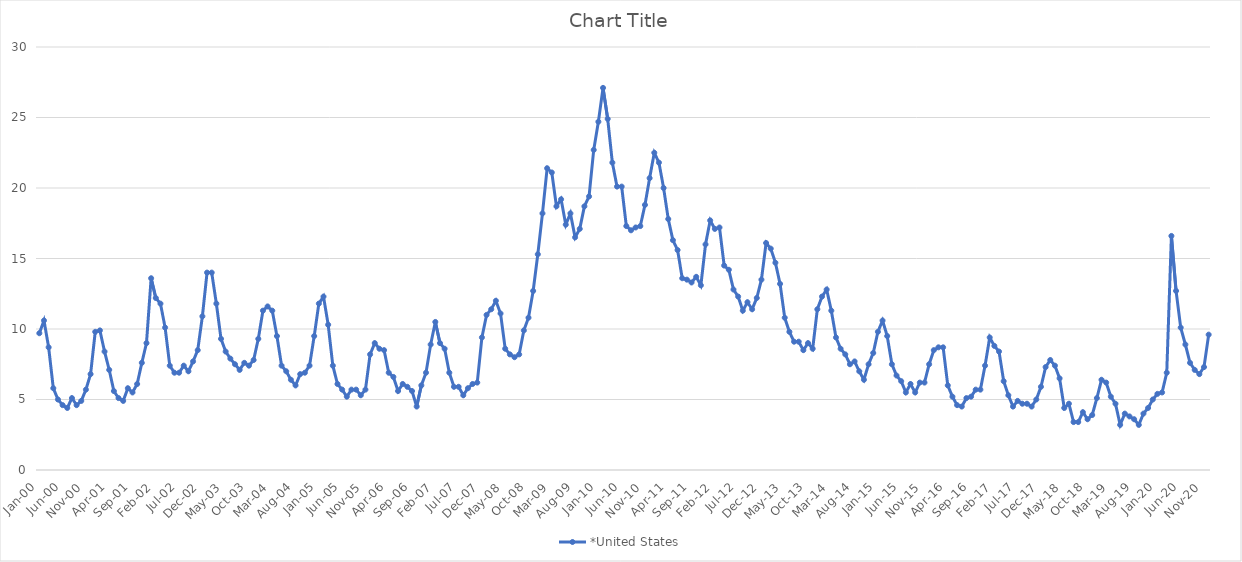
| Category | *United States | Alaska | Alabama | Arkansas | Arizona | California | Colorado | Connecticut | Delaware | Florida | Georgia | Hawaii | Iowa | Idaho | Illinois | Indiana | Kansas | Kentucky | Louisiana | Massachusetts | Maryland | Maine | Michigan | Minnesota | Missouri | Mississippi | Montana | North Carolina | North Dakota | Nebraska | New Hampshire | New Jersey | New Mexico | Nevada | New York | Ohio | Oklahoma | Oregon | Pennsylvania | Rhode Island | South Carolina | South Dakota | Tennessee | Texas | Utah | Virginia | Vermont | Washington | Wisconsin | West Virginia | Wyoming |
|---|---|---|---|---|---|---|---|---|---|---|---|---|---|---|---|---|---|---|---|---|---|---|---|---|---|---|---|---|---|---|---|---|---|---|---|---|---|---|---|---|---|---|---|---|---|---|---|---|---|---|---|
| Jan-00 | 9.7 |  |  |  |  |  |  |  |  |  |  |  |  |  |  |  |  |  |  |  |  |  |  |  |  |  |  |  |  |  |  |  |  |  |  |  |  |  |  |  |  |  |  |  |  |  |  |  |  |  |  |
| Feb-00 | 10.6 |  |  |  |  |  |  |  |  |  |  |  |  |  |  |  |  |  |  |  |  |  |  |  |  |  |  |  |  |  |  |  |  |  |  |  |  |  |  |  |  |  |  |  |  |  |  |  |  |  |  |
| Mar-00 | 8.7 |  |  |  |  |  |  |  |  |  |  |  |  |  |  |  |  |  |  |  |  |  |  |  |  |  |  |  |  |  |  |  |  |  |  |  |  |  |  |  |  |  |  |  |  |  |  |  |  |  |  |
| Apr-00 | 5.8 |  |  |  |  |  |  |  |  |  |  |  |  |  |  |  |  |  |  |  |  |  |  |  |  |  |  |  |  |  |  |  |  |  |  |  |  |  |  |  |  |  |  |  |  |  |  |  |  |  |  |
| May-00 | 5 |  |  |  |  |  |  |  |  |  |  |  |  |  |  |  |  |  |  |  |  |  |  |  |  |  |  |  |  |  |  |  |  |  |  |  |  |  |  |  |  |  |  |  |  |  |  |  |  |  |  |
| Jun-00 | 4.6 |  |  |  |  |  |  |  |  |  |  |  |  |  |  |  |  |  |  |  |  |  |  |  |  |  |  |  |  |  |  |  |  |  |  |  |  |  |  |  |  |  |  |  |  |  |  |  |  |  |  |
| Jul-00 | 4.4 |  |  |  |  |  |  |  |  |  |  |  |  |  |  |  |  |  |  |  |  |  |  |  |  |  |  |  |  |  |  |  |  |  |  |  |  |  |  |  |  |  |  |  |  |  |  |  |  |  |  |
| Aug-00 | 5.1 |  |  |  |  |  |  |  |  |  |  |  |  |  |  |  |  |  |  |  |  |  |  |  |  |  |  |  |  |  |  |  |  |  |  |  |  |  |  |  |  |  |  |  |  |  |  |  |  |  |  |
| Sep-00 | 4.6 |  |  |  |  |  |  |  |  |  |  |  |  |  |  |  |  |  |  |  |  |  |  |  |  |  |  |  |  |  |  |  |  |  |  |  |  |  |  |  |  |  |  |  |  |  |  |  |  |  |  |
| Oct-00 | 4.9 |  |  |  |  |  |  |  |  |  |  |  |  |  |  |  |  |  |  |  |  |  |  |  |  |  |  |  |  |  |  |  |  |  |  |  |  |  |  |  |  |  |  |  |  |  |  |  |  |  |  |
| Nov-00 | 5.7 |  |  |  |  |  |  |  |  |  |  |  |  |  |  |  |  |  |  |  |  |  |  |  |  |  |  |  |  |  |  |  |  |  |  |  |  |  |  |  |  |  |  |  |  |  |  |  |  |  |  |
| Dec-00 | 6.8 |  |  |  |  |  |  |  |  |  |  |  |  |  |  |  |  |  |  |  |  |  |  |  |  |  |  |  |  |  |  |  |  |  |  |  |  |  |  |  |  |  |  |  |  |  |  |  |  |  |  |
| Jan-01 | 9.8 |  |  |  |  |  |  |  |  |  |  |  |  |  |  |  |  |  |  |  |  |  |  |  |  |  |  |  |  |  |  |  |  |  |  |  |  |  |  |  |  |  |  |  |  |  |  |  |  |  |  |
| Feb-01 | 9.9 |  |  |  |  |  |  |  |  |  |  |  |  |  |  |  |  |  |  |  |  |  |  |  |  |  |  |  |  |  |  |  |  |  |  |  |  |  |  |  |  |  |  |  |  |  |  |  |  |  |  |
| Mar-01 | 8.4 |  |  |  |  |  |  |  |  |  |  |  |  |  |  |  |  |  |  |  |  |  |  |  |  |  |  |  |  |  |  |  |  |  |  |  |  |  |  |  |  |  |  |  |  |  |  |  |  |  |  |
| Apr-01 | 7.1 |  |  |  |  |  |  |  |  |  |  |  |  |  |  |  |  |  |  |  |  |  |  |  |  |  |  |  |  |  |  |  |  |  |  |  |  |  |  |  |  |  |  |  |  |  |  |  |  |  |  |
| May-01 | 5.6 |  |  |  |  |  |  |  |  |  |  |  |  |  |  |  |  |  |  |  |  |  |  |  |  |  |  |  |  |  |  |  |  |  |  |  |  |  |  |  |  |  |  |  |  |  |  |  |  |  |  |
| Jun-01 | 5.1 |  |  |  |  |  |  |  |  |  |  |  |  |  |  |  |  |  |  |  |  |  |  |  |  |  |  |  |  |  |  |  |  |  |  |  |  |  |  |  |  |  |  |  |  |  |  |  |  |  |  |
| Jul-01 | 4.9 |  |  |  |  |  |  |  |  |  |  |  |  |  |  |  |  |  |  |  |  |  |  |  |  |  |  |  |  |  |  |  |  |  |  |  |  |  |  |  |  |  |  |  |  |  |  |  |  |  |  |
| Aug-01 | 5.8 |  |  |  |  |  |  |  |  |  |  |  |  |  |  |  |  |  |  |  |  |  |  |  |  |  |  |  |  |  |  |  |  |  |  |  |  |  |  |  |  |  |  |  |  |  |  |  |  |  |  |
| Sep-01 | 5.5 |  |  |  |  |  |  |  |  |  |  |  |  |  |  |  |  |  |  |  |  |  |  |  |  |  |  |  |  |  |  |  |  |  |  |  |  |  |  |  |  |  |  |  |  |  |  |  |  |  |  |
| Oct-01 | 6.1 |  |  |  |  |  |  |  |  |  |  |  |  |  |  |  |  |  |  |  |  |  |  |  |  |  |  |  |  |  |  |  |  |  |  |  |  |  |  |  |  |  |  |  |  |  |  |  |  |  |  |
| Nov-01 | 7.6 |  |  |  |  |  |  |  |  |  |  |  |  |  |  |  |  |  |  |  |  |  |  |  |  |  |  |  |  |  |  |  |  |  |  |  |  |  |  |  |  |  |  |  |  |  |  |  |  |  |  |
| Dec-01 | 9 |  |  |  |  |  |  |  |  |  |  |  |  |  |  |  |  |  |  |  |  |  |  |  |  |  |  |  |  |  |  |  |  |  |  |  |  |  |  |  |  |  |  |  |  |  |  |  |  |  |  |
| Jan-02 | 13.6 |  |  |  |  |  |  |  |  |  |  |  |  |  |  |  |  |  |  |  |  |  |  |  |  |  |  |  |  |  |  |  |  |  |  |  |  |  |  |  |  |  |  |  |  |  |  |  |  |  |  |
| Feb-02 | 12.2 |  |  |  |  |  |  |  |  |  |  |  |  |  |  |  |  |  |  |  |  |  |  |  |  |  |  |  |  |  |  |  |  |  |  |  |  |  |  |  |  |  |  |  |  |  |  |  |  |  |  |
| Mar-02 | 11.8 |  |  |  |  |  |  |  |  |  |  |  |  |  |  |  |  |  |  |  |  |  |  |  |  |  |  |  |  |  |  |  |  |  |  |  |  |  |  |  |  |  |  |  |  |  |  |  |  |  |  |
| Apr-02 | 10.1 |  |  |  |  |  |  |  |  |  |  |  |  |  |  |  |  |  |  |  |  |  |  |  |  |  |  |  |  |  |  |  |  |  |  |  |  |  |  |  |  |  |  |  |  |  |  |  |  |  |  |
| May-02 | 7.4 |  |  |  |  |  |  |  |  |  |  |  |  |  |  |  |  |  |  |  |  |  |  |  |  |  |  |  |  |  |  |  |  |  |  |  |  |  |  |  |  |  |  |  |  |  |  |  |  |  |  |
| Jun-02 | 6.9 |  |  |  |  |  |  |  |  |  |  |  |  |  |  |  |  |  |  |  |  |  |  |  |  |  |  |  |  |  |  |  |  |  |  |  |  |  |  |  |  |  |  |  |  |  |  |  |  |  |  |
| Jul-02 | 6.9 |  |  |  |  |  |  |  |  |  |  |  |  |  |  |  |  |  |  |  |  |  |  |  |  |  |  |  |  |  |  |  |  |  |  |  |  |  |  |  |  |  |  |  |  |  |  |  |  |  |  |
| Aug-02 | 7.4 |  |  |  |  |  |  |  |  |  |  |  |  |  |  |  |  |  |  |  |  |  |  |  |  |  |  |  |  |  |  |  |  |  |  |  |  |  |  |  |  |  |  |  |  |  |  |  |  |  |  |
| Sep-02 | 7 |  |  |  |  |  |  |  |  |  |  |  |  |  |  |  |  |  |  |  |  |  |  |  |  |  |  |  |  |  |  |  |  |  |  |  |  |  |  |  |  |  |  |  |  |  |  |  |  |  |  |
| Oct-02 | 7.7 |  |  |  |  |  |  |  |  |  |  |  |  |  |  |  |  |  |  |  |  |  |  |  |  |  |  |  |  |  |  |  |  |  |  |  |  |  |  |  |  |  |  |  |  |  |  |  |  |  |  |
| Nov-02 | 8.5 |  |  |  |  |  |  |  |  |  |  |  |  |  |  |  |  |  |  |  |  |  |  |  |  |  |  |  |  |  |  |  |  |  |  |  |  |  |  |  |  |  |  |  |  |  |  |  |  |  |  |
| Dec-02 | 10.9 |  |  |  |  |  |  |  |  |  |  |  |  |  |  |  |  |  |  |  |  |  |  |  |  |  |  |  |  |  |  |  |  |  |  |  |  |  |  |  |  |  |  |  |  |  |  |  |  |  |  |
| Jan-03 | 14 |  |  |  |  |  |  |  |  |  |  |  |  |  |  |  |  |  |  |  |  |  |  |  |  |  |  |  |  |  |  |  |  |  |  |  |  |  |  |  |  |  |  |  |  |  |  |  |  |  |  |
| Feb-03 | 14 |  |  |  |  |  |  |  |  |  |  |  |  |  |  |  |  |  |  |  |  |  |  |  |  |  |  |  |  |  |  |  |  |  |  |  |  |  |  |  |  |  |  |  |  |  |  |  |  |  |  |
| Mar-03 | 11.8 |  |  |  |  |  |  |  |  |  |  |  |  |  |  |  |  |  |  |  |  |  |  |  |  |  |  |  |  |  |  |  |  |  |  |  |  |  |  |  |  |  |  |  |  |  |  |  |  |  |  |
| Apr-03 | 9.3 |  |  |  |  |  |  |  |  |  |  |  |  |  |  |  |  |  |  |  |  |  |  |  |  |  |  |  |  |  |  |  |  |  |  |  |  |  |  |  |  |  |  |  |  |  |  |  |  |  |  |
| May-03 | 8.4 |  |  |  |  |  |  |  |  |  |  |  |  |  |  |  |  |  |  |  |  |  |  |  |  |  |  |  |  |  |  |  |  |  |  |  |  |  |  |  |  |  |  |  |  |  |  |  |  |  |  |
| Jun-03 | 7.9 |  |  |  |  |  |  |  |  |  |  |  |  |  |  |  |  |  |  |  |  |  |  |  |  |  |  |  |  |  |  |  |  |  |  |  |  |  |  |  |  |  |  |  |  |  |  |  |  |  |  |
| Jul-03 | 7.5 |  |  |  |  |  |  |  |  |  |  |  |  |  |  |  |  |  |  |  |  |  |  |  |  |  |  |  |  |  |  |  |  |  |  |  |  |  |  |  |  |  |  |  |  |  |  |  |  |  |  |
| Aug-03 | 7.1 |  |  |  |  |  |  |  |  |  |  |  |  |  |  |  |  |  |  |  |  |  |  |  |  |  |  |  |  |  |  |  |  |  |  |  |  |  |  |  |  |  |  |  |  |  |  |  |  |  |  |
| Sep-03 | 7.6 |  |  |  |  |  |  |  |  |  |  |  |  |  |  |  |  |  |  |  |  |  |  |  |  |  |  |  |  |  |  |  |  |  |  |  |  |  |  |  |  |  |  |  |  |  |  |  |  |  |  |
| Oct-03 | 7.4 |  |  |  |  |  |  |  |  |  |  |  |  |  |  |  |  |  |  |  |  |  |  |  |  |  |  |  |  |  |  |  |  |  |  |  |  |  |  |  |  |  |  |  |  |  |  |  |  |  |  |
| Nov-03 | 7.8 |  |  |  |  |  |  |  |  |  |  |  |  |  |  |  |  |  |  |  |  |  |  |  |  |  |  |  |  |  |  |  |  |  |  |  |  |  |  |  |  |  |  |  |  |  |  |  |  |  |  |
| Dec-03 | 9.3 |  |  |  |  |  |  |  |  |  |  |  |  |  |  |  |  |  |  |  |  |  |  |  |  |  |  |  |  |  |  |  |  |  |  |  |  |  |  |  |  |  |  |  |  |  |  |  |  |  |  |
| Jan-04 | 11.3 |  |  |  |  |  |  |  |  |  |  |  |  |  |  |  |  |  |  |  |  |  |  |  |  |  |  |  |  |  |  |  |  |  |  |  |  |  |  |  |  |  |  |  |  |  |  |  |  |  |  |
| Feb-04 | 11.6 |  |  |  |  |  |  |  |  |  |  |  |  |  |  |  |  |  |  |  |  |  |  |  |  |  |  |  |  |  |  |  |  |  |  |  |  |  |  |  |  |  |  |  |  |  |  |  |  |  |  |
| Mar-04 | 11.3 |  |  |  |  |  |  |  |  |  |  |  |  |  |  |  |  |  |  |  |  |  |  |  |  |  |  |  |  |  |  |  |  |  |  |  |  |  |  |  |  |  |  |  |  |  |  |  |  |  |  |
| Apr-04 | 9.5 |  |  |  |  |  |  |  |  |  |  |  |  |  |  |  |  |  |  |  |  |  |  |  |  |  |  |  |  |  |  |  |  |  |  |  |  |  |  |  |  |  |  |  |  |  |  |  |  |  |  |
| May-04 | 7.4 |  |  |  |  |  |  |  |  |  |  |  |  |  |  |  |  |  |  |  |  |  |  |  |  |  |  |  |  |  |  |  |  |  |  |  |  |  |  |  |  |  |  |  |  |  |  |  |  |  |  |
| Jun-04 | 7 |  |  |  |  |  |  |  |  |  |  |  |  |  |  |  |  |  |  |  |  |  |  |  |  |  |  |  |  |  |  |  |  |  |  |  |  |  |  |  |  |  |  |  |  |  |  |  |  |  |  |
| Jul-04 | 6.4 |  |  |  |  |  |  |  |  |  |  |  |  |  |  |  |  |  |  |  |  |  |  |  |  |  |  |  |  |  |  |  |  |  |  |  |  |  |  |  |  |  |  |  |  |  |  |  |  |  |  |
| Aug-04 | 6 |  |  |  |  |  |  |  |  |  |  |  |  |  |  |  |  |  |  |  |  |  |  |  |  |  |  |  |  |  |  |  |  |  |  |  |  |  |  |  |  |  |  |  |  |  |  |  |  |  |  |
| Sep-04 | 6.8 |  |  |  |  |  |  |  |  |  |  |  |  |  |  |  |  |  |  |  |  |  |  |  |  |  |  |  |  |  |  |  |  |  |  |  |  |  |  |  |  |  |  |  |  |  |  |  |  |  |  |
| Oct-04 | 6.9 |  |  |  |  |  |  |  |  |  |  |  |  |  |  |  |  |  |  |  |  |  |  |  |  |  |  |  |  |  |  |  |  |  |  |  |  |  |  |  |  |  |  |  |  |  |  |  |  |  |  |
| Nov-04 | 7.4 |  |  |  |  |  |  |  |  |  |  |  |  |  |  |  |  |  |  |  |  |  |  |  |  |  |  |  |  |  |  |  |  |  |  |  |  |  |  |  |  |  |  |  |  |  |  |  |  |  |  |
| Dec-04 | 9.5 |  |  |  |  |  |  |  |  |  |  |  |  |  |  |  |  |  |  |  |  |  |  |  |  |  |  |  |  |  |  |  |  |  |  |  |  |  |  |  |  |  |  |  |  |  |  |  |  |  |  |
| Jan-05 | 11.8 |  |  |  |  |  |  |  |  |  |  |  |  |  |  |  |  |  |  |  |  |  |  |  |  |  |  |  |  |  |  |  |  |  |  |  |  |  |  |  |  |  |  |  |  |  |  |  |  |  |  |
| Feb-05 | 12.3 |  |  |  |  |  |  |  |  |  |  |  |  |  |  |  |  |  |  |  |  |  |  |  |  |  |  |  |  |  |  |  |  |  |  |  |  |  |  |  |  |  |  |  |  |  |  |  |  |  |  |
| Mar-05 | 10.3 |  |  |  |  |  |  |  |  |  |  |  |  |  |  |  |  |  |  |  |  |  |  |  |  |  |  |  |  |  |  |  |  |  |  |  |  |  |  |  |  |  |  |  |  |  |  |  |  |  |  |
| Apr-05 | 7.4 |  |  |  |  |  |  |  |  |  |  |  |  |  |  |  |  |  |  |  |  |  |  |  |  |  |  |  |  |  |  |  |  |  |  |  |  |  |  |  |  |  |  |  |  |  |  |  |  |  |  |
| May-05 | 6.1 |  |  |  |  |  |  |  |  |  |  |  |  |  |  |  |  |  |  |  |  |  |  |  |  |  |  |  |  |  |  |  |  |  |  |  |  |  |  |  |  |  |  |  |  |  |  |  |  |  |  |
| Jun-05 | 5.7 |  |  |  |  |  |  |  |  |  |  |  |  |  |  |  |  |  |  |  |  |  |  |  |  |  |  |  |  |  |  |  |  |  |  |  |  |  |  |  |  |  |  |  |  |  |  |  |  |  |  |
| Jul-05 | 5.2 |  |  |  |  |  |  |  |  |  |  |  |  |  |  |  |  |  |  |  |  |  |  |  |  |  |  |  |  |  |  |  |  |  |  |  |  |  |  |  |  |  |  |  |  |  |  |  |  |  |  |
| Aug-05 | 5.7 |  |  |  |  |  |  |  |  |  |  |  |  |  |  |  |  |  |  |  |  |  |  |  |  |  |  |  |  |  |  |  |  |  |  |  |  |  |  |  |  |  |  |  |  |  |  |  |  |  |  |
| Sep-05 | 5.7 |  |  |  |  |  |  |  |  |  |  |  |  |  |  |  |  |  |  |  |  |  |  |  |  |  |  |  |  |  |  |  |  |  |  |  |  |  |  |  |  |  |  |  |  |  |  |  |  |  |  |
| Oct-05 | 5.3 |  |  |  |  |  |  |  |  |  |  |  |  |  |  |  |  |  |  |  |  |  |  |  |  |  |  |  |  |  |  |  |  |  |  |  |  |  |  |  |  |  |  |  |  |  |  |  |  |  |  |
| Nov-05 | 5.7 |  |  |  |  |  |  |  |  |  |  |  |  |  |  |  |  |  |  |  |  |  |  |  |  |  |  |  |  |  |  |  |  |  |  |  |  |  |  |  |  |  |  |  |  |  |  |  |  |  |  |
| Dec-05 | 8.2 |  |  |  |  |  |  |  |  |  |  |  |  |  |  |  |  |  |  |  |  |  |  |  |  |  |  |  |  |  |  |  |  |  |  |  |  |  |  |  |  |  |  |  |  |  |  |  |  |  |  |
| Jan-06 | 9 |  |  |  |  |  |  |  |  |  |  |  |  |  |  |  |  |  |  |  |  |  |  |  |  |  |  |  |  |  |  |  |  |  |  |  |  |  |  |  |  |  |  |  |  |  |  |  |  |  |  |
| Feb-06 | 8.6 |  |  |  |  |  |  |  |  |  |  |  |  |  |  |  |  |  |  |  |  |  |  |  |  |  |  |  |  |  |  |  |  |  |  |  |  |  |  |  |  |  |  |  |  |  |  |  |  |  |  |
| Mar-06 | 8.5 |  |  |  |  |  |  |  |  |  |  |  |  |  |  |  |  |  |  |  |  |  |  |  |  |  |  |  |  |  |  |  |  |  |  |  |  |  |  |  |  |  |  |  |  |  |  |  |  |  |  |
| Apr-06 | 6.9 |  |  |  |  |  |  |  |  |  |  |  |  |  |  |  |  |  |  |  |  |  |  |  |  |  |  |  |  |  |  |  |  |  |  |  |  |  |  |  |  |  |  |  |  |  |  |  |  |  |  |
| May-06 | 6.6 |  |  |  |  |  |  |  |  |  |  |  |  |  |  |  |  |  |  |  |  |  |  |  |  |  |  |  |  |  |  |  |  |  |  |  |  |  |  |  |  |  |  |  |  |  |  |  |  |  |  |
| Jun-06 | 5.6 |  |  |  |  |  |  |  |  |  |  |  |  |  |  |  |  |  |  |  |  |  |  |  |  |  |  |  |  |  |  |  |  |  |  |  |  |  |  |  |  |  |  |  |  |  |  |  |  |  |  |
| Jul-06 | 6.1 |  |  |  |  |  |  |  |  |  |  |  |  |  |  |  |  |  |  |  |  |  |  |  |  |  |  |  |  |  |  |  |  |  |  |  |  |  |  |  |  |  |  |  |  |  |  |  |  |  |  |
| Aug-06 | 5.9 |  |  |  |  |  |  |  |  |  |  |  |  |  |  |  |  |  |  |  |  |  |  |  |  |  |  |  |  |  |  |  |  |  |  |  |  |  |  |  |  |  |  |  |  |  |  |  |  |  |  |
| Sep-06 | 5.6 |  |  |  |  |  |  |  |  |  |  |  |  |  |  |  |  |  |  |  |  |  |  |  |  |  |  |  |  |  |  |  |  |  |  |  |  |  |  |  |  |  |  |  |  |  |  |  |  |  |  |
| Oct-06 | 4.5 |  |  |  |  |  |  |  |  |  |  |  |  |  |  |  |  |  |  |  |  |  |  |  |  |  |  |  |  |  |  |  |  |  |  |  |  |  |  |  |  |  |  |  |  |  |  |  |  |  |  |
| Nov-06 | 6 |  |  |  |  |  |  |  |  |  |  |  |  |  |  |  |  |  |  |  |  |  |  |  |  |  |  |  |  |  |  |  |  |  |  |  |  |  |  |  |  |  |  |  |  |  |  |  |  |  |  |
| Dec-06 | 6.9 |  |  |  |  |  |  |  |  |  |  |  |  |  |  |  |  |  |  |  |  |  |  |  |  |  |  |  |  |  |  |  |  |  |  |  |  |  |  |  |  |  |  |  |  |  |  |  |  |  |  |
| Jan-07 | 8.9 |  |  |  |  |  |  |  |  |  |  |  |  |  |  |  |  |  |  |  |  |  |  |  |  |  |  |  |  |  |  |  |  |  |  |  |  |  |  |  |  |  |  |  |  |  |  |  |  |  |  |
| Feb-07 | 10.5 |  |  |  |  |  |  |  |  |  |  |  |  |  |  |  |  |  |  |  |  |  |  |  |  |  |  |  |  |  |  |  |  |  |  |  |  |  |  |  |  |  |  |  |  |  |  |  |  |  |  |
| Mar-07 | 9 |  |  |  |  |  |  |  |  |  |  |  |  |  |  |  |  |  |  |  |  |  |  |  |  |  |  |  |  |  |  |  |  |  |  |  |  |  |  |  |  |  |  |  |  |  |  |  |  |  |  |
| Apr-07 | 8.6 |  |  |  |  |  |  |  |  |  |  |  |  |  |  |  |  |  |  |  |  |  |  |  |  |  |  |  |  |  |  |  |  |  |  |  |  |  |  |  |  |  |  |  |  |  |  |  |  |  |  |
| May-07 | 6.9 |  |  |  |  |  |  |  |  |  |  |  |  |  |  |  |  |  |  |  |  |  |  |  |  |  |  |  |  |  |  |  |  |  |  |  |  |  |  |  |  |  |  |  |  |  |  |  |  |  |  |
| Jun-07 | 5.9 |  |  |  |  |  |  |  |  |  |  |  |  |  |  |  |  |  |  |  |  |  |  |  |  |  |  |  |  |  |  |  |  |  |  |  |  |  |  |  |  |  |  |  |  |  |  |  |  |  |  |
| Jul-07 | 5.9 |  |  |  |  |  |  |  |  |  |  |  |  |  |  |  |  |  |  |  |  |  |  |  |  |  |  |  |  |  |  |  |  |  |  |  |  |  |  |  |  |  |  |  |  |  |  |  |  |  |  |
| Aug-07 | 5.3 |  |  |  |  |  |  |  |  |  |  |  |  |  |  |  |  |  |  |  |  |  |  |  |  |  |  |  |  |  |  |  |  |  |  |  |  |  |  |  |  |  |  |  |  |  |  |  |  |  |  |
| Sep-07 | 5.8 |  |  |  |  |  |  |  |  |  |  |  |  |  |  |  |  |  |  |  |  |  |  |  |  |  |  |  |  |  |  |  |  |  |  |  |  |  |  |  |  |  |  |  |  |  |  |  |  |  |  |
| Oct-07 | 6.1 |  |  |  |  |  |  |  |  |  |  |  |  |  |  |  |  |  |  |  |  |  |  |  |  |  |  |  |  |  |  |  |  |  |  |  |  |  |  |  |  |  |  |  |  |  |  |  |  |  |  |
| Nov-07 | 6.2 |  |  |  |  |  |  |  |  |  |  |  |  |  |  |  |  |  |  |  |  |  |  |  |  |  |  |  |  |  |  |  |  |  |  |  |  |  |  |  |  |  |  |  |  |  |  |  |  |  |  |
| Dec-07 | 9.4 |  |  |  |  |  |  |  |  |  |  |  |  |  |  |  |  |  |  |  |  |  |  |  |  |  |  |  |  |  |  |  |  |  |  |  |  |  |  |  |  |  |  |  |  |  |  |  |  |  |  |
| Jan-08 | 11 |  |  |  |  |  |  |  |  |  |  |  |  |  |  |  |  |  |  |  |  |  |  |  |  |  |  |  |  |  |  |  |  |  |  |  |  |  |  |  |  |  |  |  |  |  |  |  |  |  |  |
| Feb-08 | 11.4 |  |  |  |  |  |  |  |  |  |  |  |  |  |  |  |  |  |  |  |  |  |  |  |  |  |  |  |  |  |  |  |  |  |  |  |  |  |  |  |  |  |  |  |  |  |  |  |  |  |  |
| Mar-08 | 12 |  |  |  |  |  |  |  |  |  |  |  |  |  |  |  |  |  |  |  |  |  |  |  |  |  |  |  |  |  |  |  |  |  |  |  |  |  |  |  |  |  |  |  |  |  |  |  |  |  |  |
| Apr-08 | 11.1 |  |  |  |  |  |  |  |  |  |  |  |  |  |  |  |  |  |  |  |  |  |  |  |  |  |  |  |  |  |  |  |  |  |  |  |  |  |  |  |  |  |  |  |  |  |  |  |  |  |  |
| May-08 | 8.6 |  |  |  |  |  |  |  |  |  |  |  |  |  |  |  |  |  |  |  |  |  |  |  |  |  |  |  |  |  |  |  |  |  |  |  |  |  |  |  |  |  |  |  |  |  |  |  |  |  |  |
| Jun-08 | 8.2 |  |  |  |  |  |  |  |  |  |  |  |  |  |  |  |  |  |  |  |  |  |  |  |  |  |  |  |  |  |  |  |  |  |  |  |  |  |  |  |  |  |  |  |  |  |  |  |  |  |  |
| Jul-08 | 8 |  |  |  |  |  |  |  |  |  |  |  |  |  |  |  |  |  |  |  |  |  |  |  |  |  |  |  |  |  |  |  |  |  |  |  |  |  |  |  |  |  |  |  |  |  |  |  |  |  |  |
| Aug-08 | 8.2 |  |  |  |  |  |  |  |  |  |  |  |  |  |  |  |  |  |  |  |  |  |  |  |  |  |  |  |  |  |  |  |  |  |  |  |  |  |  |  |  |  |  |  |  |  |  |  |  |  |  |
| Sep-08 | 9.9 |  |  |  |  |  |  |  |  |  |  |  |  |  |  |  |  |  |  |  |  |  |  |  |  |  |  |  |  |  |  |  |  |  |  |  |  |  |  |  |  |  |  |  |  |  |  |  |  |  |  |
| Oct-08 | 10.8 |  |  |  |  |  |  |  |  |  |  |  |  |  |  |  |  |  |  |  |  |  |  |  |  |  |  |  |  |  |  |  |  |  |  |  |  |  |  |  |  |  |  |  |  |  |  |  |  |  |  |
| Nov-08 | 12.7 |  |  |  |  |  |  |  |  |  |  |  |  |  |  |  |  |  |  |  |  |  |  |  |  |  |  |  |  |  |  |  |  |  |  |  |  |  |  |  |  |  |  |  |  |  |  |  |  |  |  |
| Dec-08 | 15.3 |  |  |  |  |  |  |  |  |  |  |  |  |  |  |  |  |  |  |  |  |  |  |  |  |  |  |  |  |  |  |  |  |  |  |  |  |  |  |  |  |  |  |  |  |  |  |  |  |  |  |
| Jan-09 | 18.2 |  |  |  |  |  |  |  |  |  |  |  |  |  |  |  |  |  |  |  |  |  |  |  |  |  |  |  |  |  |  |  |  |  |  |  |  |  |  |  |  |  |  |  |  |  |  |  |  |  |  |
| Feb-09 | 21.4 |  |  |  |  |  |  |  |  |  |  |  |  |  |  |  |  |  |  |  |  |  |  |  |  |  |  |  |  |  |  |  |  |  |  |  |  |  |  |  |  |  |  |  |  |  |  |  |  |  |  |
| Mar-09 | 21.1 |  |  |  |  |  |  |  |  |  |  |  |  |  |  |  |  |  |  |  |  |  |  |  |  |  |  |  |  |  |  |  |  |  |  |  |  |  |  |  |  |  |  |  |  |  |  |  |  |  |  |
| Apr-09 | 18.7 |  |  |  |  |  |  |  |  |  |  |  |  |  |  |  |  |  |  |  |  |  |  |  |  |  |  |  |  |  |  |  |  |  |  |  |  |  |  |  |  |  |  |  |  |  |  |  |  |  |  |
| May-09 | 19.2 |  |  |  |  |  |  |  |  |  |  |  |  |  |  |  |  |  |  |  |  |  |  |  |  |  |  |  |  |  |  |  |  |  |  |  |  |  |  |  |  |  |  |  |  |  |  |  |  |  |  |
| Jun-09 | 17.4 |  |  |  |  |  |  |  |  |  |  |  |  |  |  |  |  |  |  |  |  |  |  |  |  |  |  |  |  |  |  |  |  |  |  |  |  |  |  |  |  |  |  |  |  |  |  |  |  |  |  |
| Jul-09 | 18.2 |  |  |  |  |  |  |  |  |  |  |  |  |  |  |  |  |  |  |  |  |  |  |  |  |  |  |  |  |  |  |  |  |  |  |  |  |  |  |  |  |  |  |  |  |  |  |  |  |  |  |
| Aug-09 | 16.5 |  |  |  |  |  |  |  |  |  |  |  |  |  |  |  |  |  |  |  |  |  |  |  |  |  |  |  |  |  |  |  |  |  |  |  |  |  |  |  |  |  |  |  |  |  |  |  |  |  |  |
| Sep-09 | 17.1 |  |  |  |  |  |  |  |  |  |  |  |  |  |  |  |  |  |  |  |  |  |  |  |  |  |  |  |  |  |  |  |  |  |  |  |  |  |  |  |  |  |  |  |  |  |  |  |  |  |  |
| Oct-09 | 18.7 |  |  |  |  |  |  |  |  |  |  |  |  |  |  |  |  |  |  |  |  |  |  |  |  |  |  |  |  |  |  |  |  |  |  |  |  |  |  |  |  |  |  |  |  |  |  |  |  |  |  |
| Nov-09 | 19.4 |  |  |  |  |  |  |  |  |  |  |  |  |  |  |  |  |  |  |  |  |  |  |  |  |  |  |  |  |  |  |  |  |  |  |  |  |  |  |  |  |  |  |  |  |  |  |  |  |  |  |
| Dec-09 | 22.7 |  |  |  |  |  |  |  |  |  |  |  |  |  |  |  |  |  |  |  |  |  |  |  |  |  |  |  |  |  |  |  |  |  |  |  |  |  |  |  |  |  |  |  |  |  |  |  |  |  |  |
| Jan-10 | 24.7 |  |  |  |  |  |  |  |  |  |  |  |  |  |  |  |  |  |  |  |  |  |  |  |  |  |  |  |  |  |  |  |  |  |  |  |  |  |  |  |  |  |  |  |  |  |  |  |  |  |  |
| Feb-10 | 27.1 |  |  |  |  |  |  |  |  |  |  |  |  |  |  |  |  |  |  |  |  |  |  |  |  |  |  |  |  |  |  |  |  |  |  |  |  |  |  |  |  |  |  |  |  |  |  |  |  |  |  |
| Mar-10 | 24.9 |  |  |  |  |  |  |  |  |  |  |  |  |  |  |  |  |  |  |  |  |  |  |  |  |  |  |  |  |  |  |  |  |  |  |  |  |  |  |  |  |  |  |  |  |  |  |  |  |  |  |
| Apr-10 | 21.8 |  |  |  |  |  |  |  |  |  |  |  |  |  |  |  |  |  |  |  |  |  |  |  |  |  |  |  |  |  |  |  |  |  |  |  |  |  |  |  |  |  |  |  |  |  |  |  |  |  |  |
| May-10 | 20.1 |  |  |  |  |  |  |  |  |  |  |  |  |  |  |  |  |  |  |  |  |  |  |  |  |  |  |  |  |  |  |  |  |  |  |  |  |  |  |  |  |  |  |  |  |  |  |  |  |  |  |
| Jun-10 | 20.1 |  |  |  |  |  |  |  |  |  |  |  |  |  |  |  |  |  |  |  |  |  |  |  |  |  |  |  |  |  |  |  |  |  |  |  |  |  |  |  |  |  |  |  |  |  |  |  |  |  |  |
| Jul-10 | 17.3 |  |  |  |  |  |  |  |  |  |  |  |  |  |  |  |  |  |  |  |  |  |  |  |  |  |  |  |  |  |  |  |  |  |  |  |  |  |  |  |  |  |  |  |  |  |  |  |  |  |  |
| Aug-10 | 17 |  |  |  |  |  |  |  |  |  |  |  |  |  |  |  |  |  |  |  |  |  |  |  |  |  |  |  |  |  |  |  |  |  |  |  |  |  |  |  |  |  |  |  |  |  |  |  |  |  |  |
| Sep-10 | 17.2 |  |  |  |  |  |  |  |  |  |  |  |  |  |  |  |  |  |  |  |  |  |  |  |  |  |  |  |  |  |  |  |  |  |  |  |  |  |  |  |  |  |  |  |  |  |  |  |  |  |  |
| Oct-10 | 17.3 |  |  |  |  |  |  |  |  |  |  |  |  |  |  |  |  |  |  |  |  |  |  |  |  |  |  |  |  |  |  |  |  |  |  |  |  |  |  |  |  |  |  |  |  |  |  |  |  |  |  |
| Nov-10 | 18.8 |  |  |  |  |  |  |  |  |  |  |  |  |  |  |  |  |  |  |  |  |  |  |  |  |  |  |  |  |  |  |  |  |  |  |  |  |  |  |  |  |  |  |  |  |  |  |  |  |  |  |
| Dec-10 | 20.7 |  |  |  |  |  |  |  |  |  |  |  |  |  |  |  |  |  |  |  |  |  |  |  |  |  |  |  |  |  |  |  |  |  |  |  |  |  |  |  |  |  |  |  |  |  |  |  |  |  |  |
| Jan-11 | 22.5 |  |  |  |  |  |  |  |  |  |  |  |  |  |  |  |  |  |  |  |  |  |  |  |  |  |  |  |  |  |  |  |  |  |  |  |  |  |  |  |  |  |  |  |  |  |  |  |  |  |  |
| Feb-11 | 21.8 |  |  |  |  |  |  |  |  |  |  |  |  |  |  |  |  |  |  |  |  |  |  |  |  |  |  |  |  |  |  |  |  |  |  |  |  |  |  |  |  |  |  |  |  |  |  |  |  |  |  |
| Mar-11 | 20 |  |  |  |  |  |  |  |  |  |  |  |  |  |  |  |  |  |  |  |  |  |  |  |  |  |  |  |  |  |  |  |  |  |  |  |  |  |  |  |  |  |  |  |  |  |  |  |  |  |  |
| Apr-11 | 17.8 |  |  |  |  |  |  |  |  |  |  |  |  |  |  |  |  |  |  |  |  |  |  |  |  |  |  |  |  |  |  |  |  |  |  |  |  |  |  |  |  |  |  |  |  |  |  |  |  |  |  |
| May-11 | 16.3 |  |  |  |  |  |  |  |  |  |  |  |  |  |  |  |  |  |  |  |  |  |  |  |  |  |  |  |  |  |  |  |  |  |  |  |  |  |  |  |  |  |  |  |  |  |  |  |  |  |  |
| Jun-11 | 15.6 |  |  |  |  |  |  |  |  |  |  |  |  |  |  |  |  |  |  |  |  |  |  |  |  |  |  |  |  |  |  |  |  |  |  |  |  |  |  |  |  |  |  |  |  |  |  |  |  |  |  |
| Jul-11 | 13.6 |  |  |  |  |  |  |  |  |  |  |  |  |  |  |  |  |  |  |  |  |  |  |  |  |  |  |  |  |  |  |  |  |  |  |  |  |  |  |  |  |  |  |  |  |  |  |  |  |  |  |
| Aug-11 | 13.5 |  |  |  |  |  |  |  |  |  |  |  |  |  |  |  |  |  |  |  |  |  |  |  |  |  |  |  |  |  |  |  |  |  |  |  |  |  |  |  |  |  |  |  |  |  |  |  |  |  |  |
| Sep-11 | 13.3 |  |  |  |  |  |  |  |  |  |  |  |  |  |  |  |  |  |  |  |  |  |  |  |  |  |  |  |  |  |  |  |  |  |  |  |  |  |  |  |  |  |  |  |  |  |  |  |  |  |  |
| Oct-11 | 13.7 |  |  |  |  |  |  |  |  |  |  |  |  |  |  |  |  |  |  |  |  |  |  |  |  |  |  |  |  |  |  |  |  |  |  |  |  |  |  |  |  |  |  |  |  |  |  |  |  |  |  |
| Nov-11 | 13.1 |  |  |  |  |  |  |  |  |  |  |  |  |  |  |  |  |  |  |  |  |  |  |  |  |  |  |  |  |  |  |  |  |  |  |  |  |  |  |  |  |  |  |  |  |  |  |  |  |  |  |
| Dec-11 | 16 |  |  |  |  |  |  |  |  |  |  |  |  |  |  |  |  |  |  |  |  |  |  |  |  |  |  |  |  |  |  |  |  |  |  |  |  |  |  |  |  |  |  |  |  |  |  |  |  |  |  |
| Jan-12 | 17.7 |  |  |  |  |  |  |  |  |  |  |  |  |  |  |  |  |  |  |  |  |  |  |  |  |  |  |  |  |  |  |  |  |  |  |  |  |  |  |  |  |  |  |  |  |  |  |  |  |  |  |
| Feb-12 | 17.1 |  |  |  |  |  |  |  |  |  |  |  |  |  |  |  |  |  |  |  |  |  |  |  |  |  |  |  |  |  |  |  |  |  |  |  |  |  |  |  |  |  |  |  |  |  |  |  |  |  |  |
| Mar-12 | 17.2 |  |  |  |  |  |  |  |  |  |  |  |  |  |  |  |  |  |  |  |  |  |  |  |  |  |  |  |  |  |  |  |  |  |  |  |  |  |  |  |  |  |  |  |  |  |  |  |  |  |  |
| Apr-12 | 14.5 |  |  |  |  |  |  |  |  |  |  |  |  |  |  |  |  |  |  |  |  |  |  |  |  |  |  |  |  |  |  |  |  |  |  |  |  |  |  |  |  |  |  |  |  |  |  |  |  |  |  |
| May-12 | 14.2 |  |  |  |  |  |  |  |  |  |  |  |  |  |  |  |  |  |  |  |  |  |  |  |  |  |  |  |  |  |  |  |  |  |  |  |  |  |  |  |  |  |  |  |  |  |  |  |  |  |  |
| Jun-12 | 12.8 |  |  |  |  |  |  |  |  |  |  |  |  |  |  |  |  |  |  |  |  |  |  |  |  |  |  |  |  |  |  |  |  |  |  |  |  |  |  |  |  |  |  |  |  |  |  |  |  |  |  |
| Jul-12 | 12.3 |  |  |  |  |  |  |  |  |  |  |  |  |  |  |  |  |  |  |  |  |  |  |  |  |  |  |  |  |  |  |  |  |  |  |  |  |  |  |  |  |  |  |  |  |  |  |  |  |  |  |
| Aug-12 | 11.3 |  |  |  |  |  |  |  |  |  |  |  |  |  |  |  |  |  |  |  |  |  |  |  |  |  |  |  |  |  |  |  |  |  |  |  |  |  |  |  |  |  |  |  |  |  |  |  |  |  |  |
| Sep-12 | 11.9 |  |  |  |  |  |  |  |  |  |  |  |  |  |  |  |  |  |  |  |  |  |  |  |  |  |  |  |  |  |  |  |  |  |  |  |  |  |  |  |  |  |  |  |  |  |  |  |  |  |  |
| Oct-12 | 11.4 |  |  |  |  |  |  |  |  |  |  |  |  |  |  |  |  |  |  |  |  |  |  |  |  |  |  |  |  |  |  |  |  |  |  |  |  |  |  |  |  |  |  |  |  |  |  |  |  |  |  |
| Nov-12 | 12.2 |  |  |  |  |  |  |  |  |  |  |  |  |  |  |  |  |  |  |  |  |  |  |  |  |  |  |  |  |  |  |  |  |  |  |  |  |  |  |  |  |  |  |  |  |  |  |  |  |  |  |
| Dec-12 | 13.5 |  |  |  |  |  |  |  |  |  |  |  |  |  |  |  |  |  |  |  |  |  |  |  |  |  |  |  |  |  |  |  |  |  |  |  |  |  |  |  |  |  |  |  |  |  |  |  |  |  |  |
| Jan-13 | 16.1 |  |  |  |  |  |  |  |  |  |  |  |  |  |  |  |  |  |  |  |  |  |  |  |  |  |  |  |  |  |  |  |  |  |  |  |  |  |  |  |  |  |  |  |  |  |  |  |  |  |  |
| Feb-13 | 15.7 |  |  |  |  |  |  |  |  |  |  |  |  |  |  |  |  |  |  |  |  |  |  |  |  |  |  |  |  |  |  |  |  |  |  |  |  |  |  |  |  |  |  |  |  |  |  |  |  |  |  |
| Mar-13 | 14.7 |  |  |  |  |  |  |  |  |  |  |  |  |  |  |  |  |  |  |  |  |  |  |  |  |  |  |  |  |  |  |  |  |  |  |  |  |  |  |  |  |  |  |  |  |  |  |  |  |  |  |
| Apr-13 | 13.2 |  |  |  |  |  |  |  |  |  |  |  |  |  |  |  |  |  |  |  |  |  |  |  |  |  |  |  |  |  |  |  |  |  |  |  |  |  |  |  |  |  |  |  |  |  |  |  |  |  |  |
| May-13 | 10.8 |  |  |  |  |  |  |  |  |  |  |  |  |  |  |  |  |  |  |  |  |  |  |  |  |  |  |  |  |  |  |  |  |  |  |  |  |  |  |  |  |  |  |  |  |  |  |  |  |  |  |
| Jun-13 | 9.8 |  |  |  |  |  |  |  |  |  |  |  |  |  |  |  |  |  |  |  |  |  |  |  |  |  |  |  |  |  |  |  |  |  |  |  |  |  |  |  |  |  |  |  |  |  |  |  |  |  |  |
| Jul-13 | 9.1 |  |  |  |  |  |  |  |  |  |  |  |  |  |  |  |  |  |  |  |  |  |  |  |  |  |  |  |  |  |  |  |  |  |  |  |  |  |  |  |  |  |  |  |  |  |  |  |  |  |  |
| Aug-13 | 9.1 |  |  |  |  |  |  |  |  |  |  |  |  |  |  |  |  |  |  |  |  |  |  |  |  |  |  |  |  |  |  |  |  |  |  |  |  |  |  |  |  |  |  |  |  |  |  |  |  |  |  |
| Sep-13 | 8.5 |  |  |  |  |  |  |  |  |  |  |  |  |  |  |  |  |  |  |  |  |  |  |  |  |  |  |  |  |  |  |  |  |  |  |  |  |  |  |  |  |  |  |  |  |  |  |  |  |  |  |
| Oct-13 | 9 |  |  |  |  |  |  |  |  |  |  |  |  |  |  |  |  |  |  |  |  |  |  |  |  |  |  |  |  |  |  |  |  |  |  |  |  |  |  |  |  |  |  |  |  |  |  |  |  |  |  |
| Nov-13 | 8.6 |  |  |  |  |  |  |  |  |  |  |  |  |  |  |  |  |  |  |  |  |  |  |  |  |  |  |  |  |  |  |  |  |  |  |  |  |  |  |  |  |  |  |  |  |  |  |  |  |  |  |
| Dec-13 | 11.4 |  |  |  |  |  |  |  |  |  |  |  |  |  |  |  |  |  |  |  |  |  |  |  |  |  |  |  |  |  |  |  |  |  |  |  |  |  |  |  |  |  |  |  |  |  |  |  |  |  |  |
| Jan-14 | 12.3 |  |  |  |  |  |  |  |  |  |  |  |  |  |  |  |  |  |  |  |  |  |  |  |  |  |  |  |  |  |  |  |  |  |  |  |  |  |  |  |  |  |  |  |  |  |  |  |  |  |  |
| Feb-14 | 12.8 |  |  |  |  |  |  |  |  |  |  |  |  |  |  |  |  |  |  |  |  |  |  |  |  |  |  |  |  |  |  |  |  |  |  |  |  |  |  |  |  |  |  |  |  |  |  |  |  |  |  |
| Mar-14 | 11.3 |  |  |  |  |  |  |  |  |  |  |  |  |  |  |  |  |  |  |  |  |  |  |  |  |  |  |  |  |  |  |  |  |  |  |  |  |  |  |  |  |  |  |  |  |  |  |  |  |  |  |
| Apr-14 | 9.4 |  |  |  |  |  |  |  |  |  |  |  |  |  |  |  |  |  |  |  |  |  |  |  |  |  |  |  |  |  |  |  |  |  |  |  |  |  |  |  |  |  |  |  |  |  |  |  |  |  |  |
| May-14 | 8.6 |  |  |  |  |  |  |  |  |  |  |  |  |  |  |  |  |  |  |  |  |  |  |  |  |  |  |  |  |  |  |  |  |  |  |  |  |  |  |  |  |  |  |  |  |  |  |  |  |  |  |
| Jun-14 | 8.2 |  |  |  |  |  |  |  |  |  |  |  |  |  |  |  |  |  |  |  |  |  |  |  |  |  |  |  |  |  |  |  |  |  |  |  |  |  |  |  |  |  |  |  |  |  |  |  |  |  |  |
| Jul-14 | 7.5 |  |  |  |  |  |  |  |  |  |  |  |  |  |  |  |  |  |  |  |  |  |  |  |  |  |  |  |  |  |  |  |  |  |  |  |  |  |  |  |  |  |  |  |  |  |  |  |  |  |  |
| Aug-14 | 7.7 |  |  |  |  |  |  |  |  |  |  |  |  |  |  |  |  |  |  |  |  |  |  |  |  |  |  |  |  |  |  |  |  |  |  |  |  |  |  |  |  |  |  |  |  |  |  |  |  |  |  |
| Sep-14 | 7 |  |  |  |  |  |  |  |  |  |  |  |  |  |  |  |  |  |  |  |  |  |  |  |  |  |  |  |  |  |  |  |  |  |  |  |  |  |  |  |  |  |  |  |  |  |  |  |  |  |  |
| Oct-14 | 6.4 |  |  |  |  |  |  |  |  |  |  |  |  |  |  |  |  |  |  |  |  |  |  |  |  |  |  |  |  |  |  |  |  |  |  |  |  |  |  |  |  |  |  |  |  |  |  |  |  |  |  |
| Nov-14 | 7.5 |  |  |  |  |  |  |  |  |  |  |  |  |  |  |  |  |  |  |  |  |  |  |  |  |  |  |  |  |  |  |  |  |  |  |  |  |  |  |  |  |  |  |  |  |  |  |  |  |  |  |
| Dec-14 | 8.3 |  |  |  |  |  |  |  |  |  |  |  |  |  |  |  |  |  |  |  |  |  |  |  |  |  |  |  |  |  |  |  |  |  |  |  |  |  |  |  |  |  |  |  |  |  |  |  |  |  |  |
| Jan-15 | 9.8 |  |  |  |  |  |  |  |  |  |  |  |  |  |  |  |  |  |  |  |  |  |  |  |  |  |  |  |  |  |  |  |  |  |  |  |  |  |  |  |  |  |  |  |  |  |  |  |  |  |  |
| Feb-15 | 10.6 |  |  |  |  |  |  |  |  |  |  |  |  |  |  |  |  |  |  |  |  |  |  |  |  |  |  |  |  |  |  |  |  |  |  |  |  |  |  |  |  |  |  |  |  |  |  |  |  |  |  |
| Mar-15 | 9.5 |  |  |  |  |  |  |  |  |  |  |  |  |  |  |  |  |  |  |  |  |  |  |  |  |  |  |  |  |  |  |  |  |  |  |  |  |  |  |  |  |  |  |  |  |  |  |  |  |  |  |
| Apr-15 | 7.5 |  |  |  |  |  |  |  |  |  |  |  |  |  |  |  |  |  |  |  |  |  |  |  |  |  |  |  |  |  |  |  |  |  |  |  |  |  |  |  |  |  |  |  |  |  |  |  |  |  |  |
| May-15 | 6.7 |  |  |  |  |  |  |  |  |  |  |  |  |  |  |  |  |  |  |  |  |  |  |  |  |  |  |  |  |  |  |  |  |  |  |  |  |  |  |  |  |  |  |  |  |  |  |  |  |  |  |
| Jun-15 | 6.3 |  |  |  |  |  |  |  |  |  |  |  |  |  |  |  |  |  |  |  |  |  |  |  |  |  |  |  |  |  |  |  |  |  |  |  |  |  |  |  |  |  |  |  |  |  |  |  |  |  |  |
| Jul-15 | 5.5 |  |  |  |  |  |  |  |  |  |  |  |  |  |  |  |  |  |  |  |  |  |  |  |  |  |  |  |  |  |  |  |  |  |  |  |  |  |  |  |  |  |  |  |  |  |  |  |  |  |  |
| Aug-15 | 6.1 |  |  |  |  |  |  |  |  |  |  |  |  |  |  |  |  |  |  |  |  |  |  |  |  |  |  |  |  |  |  |  |  |  |  |  |  |  |  |  |  |  |  |  |  |  |  |  |  |  |  |
| Sep-15 | 5.5 |  |  |  |  |  |  |  |  |  |  |  |  |  |  |  |  |  |  |  |  |  |  |  |  |  |  |  |  |  |  |  |  |  |  |  |  |  |  |  |  |  |  |  |  |  |  |  |  |  |  |
| Oct-15 | 6.2 |  |  |  |  |  |  |  |  |  |  |  |  |  |  |  |  |  |  |  |  |  |  |  |  |  |  |  |  |  |  |  |  |  |  |  |  |  |  |  |  |  |  |  |  |  |  |  |  |  |  |
| Nov-15 | 6.2 |  |  |  |  |  |  |  |  |  |  |  |  |  |  |  |  |  |  |  |  |  |  |  |  |  |  |  |  |  |  |  |  |  |  |  |  |  |  |  |  |  |  |  |  |  |  |  |  |  |  |
| Dec-15 | 7.5 |  |  |  |  |  |  |  |  |  |  |  |  |  |  |  |  |  |  |  |  |  |  |  |  |  |  |  |  |  |  |  |  |  |  |  |  |  |  |  |  |  |  |  |  |  |  |  |  |  |  |
| Jan-16 | 8.5 |  |  |  |  |  |  |  |  |  |  |  |  |  |  |  |  |  |  |  |  |  |  |  |  |  |  |  |  |  |  |  |  |  |  |  |  |  |  |  |  |  |  |  |  |  |  |  |  |  |  |
| Feb-16 | 8.7 |  |  |  |  |  |  |  |  |  |  |  |  |  |  |  |  |  |  |  |  |  |  |  |  |  |  |  |  |  |  |  |  |  |  |  |  |  |  |  |  |  |  |  |  |  |  |  |  |  |  |
| Mar-16 | 8.7 |  |  |  |  |  |  |  |  |  |  |  |  |  |  |  |  |  |  |  |  |  |  |  |  |  |  |  |  |  |  |  |  |  |  |  |  |  |  |  |  |  |  |  |  |  |  |  |  |  |  |
| Apr-16 | 6 |  |  |  |  |  |  |  |  |  |  |  |  |  |  |  |  |  |  |  |  |  |  |  |  |  |  |  |  |  |  |  |  |  |  |  |  |  |  |  |  |  |  |  |  |  |  |  |  |  |  |
| May-16 | 5.2 |  |  |  |  |  |  |  |  |  |  |  |  |  |  |  |  |  |  |  |  |  |  |  |  |  |  |  |  |  |  |  |  |  |  |  |  |  |  |  |  |  |  |  |  |  |  |  |  |  |  |
| Jun-16 | 4.6 |  |  |  |  |  |  |  |  |  |  |  |  |  |  |  |  |  |  |  |  |  |  |  |  |  |  |  |  |  |  |  |  |  |  |  |  |  |  |  |  |  |  |  |  |  |  |  |  |  |  |
| Jul-16 | 4.5 |  |  |  |  |  |  |  |  |  |  |  |  |  |  |  |  |  |  |  |  |  |  |  |  |  |  |  |  |  |  |  |  |  |  |  |  |  |  |  |  |  |  |  |  |  |  |  |  |  |  |
| Aug-16 | 5.1 |  |  |  |  |  |  |  |  |  |  |  |  |  |  |  |  |  |  |  |  |  |  |  |  |  |  |  |  |  |  |  |  |  |  |  |  |  |  |  |  |  |  |  |  |  |  |  |  |  |  |
| Sep-16 | 5.2 |  |  |  |  |  |  |  |  |  |  |  |  |  |  |  |  |  |  |  |  |  |  |  |  |  |  |  |  |  |  |  |  |  |  |  |  |  |  |  |  |  |  |  |  |  |  |  |  |  |  |
| Oct-16 | 5.7 |  |  |  |  |  |  |  |  |  |  |  |  |  |  |  |  |  |  |  |  |  |  |  |  |  |  |  |  |  |  |  |  |  |  |  |  |  |  |  |  |  |  |  |  |  |  |  |  |  |  |
| Nov-16 | 5.7 |  |  |  |  |  |  |  |  |  |  |  |  |  |  |  |  |  |  |  |  |  |  |  |  |  |  |  |  |  |  |  |  |  |  |  |  |  |  |  |  |  |  |  |  |  |  |  |  |  |  |
| Dec-16 | 7.4 |  |  |  |  |  |  |  |  |  |  |  |  |  |  |  |  |  |  |  |  |  |  |  |  |  |  |  |  |  |  |  |  |  |  |  |  |  |  |  |  |  |  |  |  |  |  |  |  |  |  |
| Jan-17 | 9.4 |  |  |  |  |  |  |  |  |  |  |  |  |  |  |  |  |  |  |  |  |  |  |  |  |  |  |  |  |  |  |  |  |  |  |  |  |  |  |  |  |  |  |  |  |  |  |  |  |  |  |
| Feb-17 | 8.8 |  |  |  |  |  |  |  |  |  |  |  |  |  |  |  |  |  |  |  |  |  |  |  |  |  |  |  |  |  |  |  |  |  |  |  |  |  |  |  |  |  |  |  |  |  |  |  |  |  |  |
| Mar-17 | 8.4 |  |  |  |  |  |  |  |  |  |  |  |  |  |  |  |  |  |  |  |  |  |  |  |  |  |  |  |  |  |  |  |  |  |  |  |  |  |  |  |  |  |  |  |  |  |  |  |  |  |  |
| Apr-17 | 6.3 |  |  |  |  |  |  |  |  |  |  |  |  |  |  |  |  |  |  |  |  |  |  |  |  |  |  |  |  |  |  |  |  |  |  |  |  |  |  |  |  |  |  |  |  |  |  |  |  |  |  |
| May-17 | 5.3 |  |  |  |  |  |  |  |  |  |  |  |  |  |  |  |  |  |  |  |  |  |  |  |  |  |  |  |  |  |  |  |  |  |  |  |  |  |  |  |  |  |  |  |  |  |  |  |  |  |  |
| Jun-17 | 4.5 |  |  |  |  |  |  |  |  |  |  |  |  |  |  |  |  |  |  |  |  |  |  |  |  |  |  |  |  |  |  |  |  |  |  |  |  |  |  |  |  |  |  |  |  |  |  |  |  |  |  |
| Jul-17 | 4.9 |  |  |  |  |  |  |  |  |  |  |  |  |  |  |  |  |  |  |  |  |  |  |  |  |  |  |  |  |  |  |  |  |  |  |  |  |  |  |  |  |  |  |  |  |  |  |  |  |  |  |
| Aug-17 | 4.7 |  |  |  |  |  |  |  |  |  |  |  |  |  |  |  |  |  |  |  |  |  |  |  |  |  |  |  |  |  |  |  |  |  |  |  |  |  |  |  |  |  |  |  |  |  |  |  |  |  |  |
| Sep-17 | 4.7 |  |  |  |  |  |  |  |  |  |  |  |  |  |  |  |  |  |  |  |  |  |  |  |  |  |  |  |  |  |  |  |  |  |  |  |  |  |  |  |  |  |  |  |  |  |  |  |  |  |  |
| Oct-17 | 4.5 |  |  |  |  |  |  |  |  |  |  |  |  |  |  |  |  |  |  |  |  |  |  |  |  |  |  |  |  |  |  |  |  |  |  |  |  |  |  |  |  |  |  |  |  |  |  |  |  |  |  |
| Nov-17 | 5 |  |  |  |  |  |  |  |  |  |  |  |  |  |  |  |  |  |  |  |  |  |  |  |  |  |  |  |  |  |  |  |  |  |  |  |  |  |  |  |  |  |  |  |  |  |  |  |  |  |  |
| Dec-17 | 5.9 |  |  |  |  |  |  |  |  |  |  |  |  |  |  |  |  |  |  |  |  |  |  |  |  |  |  |  |  |  |  |  |  |  |  |  |  |  |  |  |  |  |  |  |  |  |  |  |  |  |  |
| Jan-18 | 7.3 |  |  |  |  |  |  |  |  |  |  |  |  |  |  |  |  |  |  |  |  |  |  |  |  |  |  |  |  |  |  |  |  |  |  |  |  |  |  |  |  |  |  |  |  |  |  |  |  |  |  |
| Feb-18 | 7.8 |  |  |  |  |  |  |  |  |  |  |  |  |  |  |  |  |  |  |  |  |  |  |  |  |  |  |  |  |  |  |  |  |  |  |  |  |  |  |  |  |  |  |  |  |  |  |  |  |  |  |
| Mar-18 | 7.4 |  |  |  |  |  |  |  |  |  |  |  |  |  |  |  |  |  |  |  |  |  |  |  |  |  |  |  |  |  |  |  |  |  |  |  |  |  |  |  |  |  |  |  |  |  |  |  |  |  |  |
| Apr-18 | 6.5 |  |  |  |  |  |  |  |  |  |  |  |  |  |  |  |  |  |  |  |  |  |  |  |  |  |  |  |  |  |  |  |  |  |  |  |  |  |  |  |  |  |  |  |  |  |  |  |  |  |  |
| May-18 | 4.4 |  |  |  |  |  |  |  |  |  |  |  |  |  |  |  |  |  |  |  |  |  |  |  |  |  |  |  |  |  |  |  |  |  |  |  |  |  |  |  |  |  |  |  |  |  |  |  |  |  |  |
| Jun-18 | 4.7 |  |  |  |  |  |  |  |  |  |  |  |  |  |  |  |  |  |  |  |  |  |  |  |  |  |  |  |  |  |  |  |  |  |  |  |  |  |  |  |  |  |  |  |  |  |  |  |  |  |  |
| Jul-18 | 3.4 |  |  |  |  |  |  |  |  |  |  |  |  |  |  |  |  |  |  |  |  |  |  |  |  |  |  |  |  |  |  |  |  |  |  |  |  |  |  |  |  |  |  |  |  |  |  |  |  |  |  |
| Aug-18 | 3.4 |  |  |  |  |  |  |  |  |  |  |  |  |  |  |  |  |  |  |  |  |  |  |  |  |  |  |  |  |  |  |  |  |  |  |  |  |  |  |  |  |  |  |  |  |  |  |  |  |  |  |
| Sep-18 | 4.1 |  |  |  |  |  |  |  |  |  |  |  |  |  |  |  |  |  |  |  |  |  |  |  |  |  |  |  |  |  |  |  |  |  |  |  |  |  |  |  |  |  |  |  |  |  |  |  |  |  |  |
| Oct-18 | 3.6 |  |  |  |  |  |  |  |  |  |  |  |  |  |  |  |  |  |  |  |  |  |  |  |  |  |  |  |  |  |  |  |  |  |  |  |  |  |  |  |  |  |  |  |  |  |  |  |  |  |  |
| Nov-18 | 3.9 |  |  |  |  |  |  |  |  |  |  |  |  |  |  |  |  |  |  |  |  |  |  |  |  |  |  |  |  |  |  |  |  |  |  |  |  |  |  |  |  |  |  |  |  |  |  |  |  |  |  |
| Dec-18 | 5.1 |  |  |  |  |  |  |  |  |  |  |  |  |  |  |  |  |  |  |  |  |  |  |  |  |  |  |  |  |  |  |  |  |  |  |  |  |  |  |  |  |  |  |  |  |  |  |  |  |  |  |
| Jan-19 | 6.4 |  |  |  |  |  |  |  |  |  |  |  |  |  |  |  |  |  |  |  |  |  |  |  |  |  |  |  |  |  |  |  |  |  |  |  |  |  |  |  |  |  |  |  |  |  |  |  |  |  |  |
| Feb-19 | 6.2 |  |  |  |  |  |  |  |  |  |  |  |  |  |  |  |  |  |  |  |  |  |  |  |  |  |  |  |  |  |  |  |  |  |  |  |  |  |  |  |  |  |  |  |  |  |  |  |  |  |  |
| Mar-19 | 5.2 |  |  |  |  |  |  |  |  |  |  |  |  |  |  |  |  |  |  |  |  |  |  |  |  |  |  |  |  |  |  |  |  |  |  |  |  |  |  |  |  |  |  |  |  |  |  |  |  |  |  |
| Apr-19 | 4.7 |  |  |  |  |  |  |  |  |  |  |  |  |  |  |  |  |  |  |  |  |  |  |  |  |  |  |  |  |  |  |  |  |  |  |  |  |  |  |  |  |  |  |  |  |  |  |  |  |  |  |
| May-19 | 3.2 |  |  |  |  |  |  |  |  |  |  |  |  |  |  |  |  |  |  |  |  |  |  |  |  |  |  |  |  |  |  |  |  |  |  |  |  |  |  |  |  |  |  |  |  |  |  |  |  |  |  |
| Jun-19 | 4 |  |  |  |  |  |  |  |  |  |  |  |  |  |  |  |  |  |  |  |  |  |  |  |  |  |  |  |  |  |  |  |  |  |  |  |  |  |  |  |  |  |  |  |  |  |  |  |  |  |  |
| Jul-19 | 3.8 |  |  |  |  |  |  |  |  |  |  |  |  |  |  |  |  |  |  |  |  |  |  |  |  |  |  |  |  |  |  |  |  |  |  |  |  |  |  |  |  |  |  |  |  |  |  |  |  |  |  |
| Aug-19 | 3.6 |  |  |  |  |  |  |  |  |  |  |  |  |  |  |  |  |  |  |  |  |  |  |  |  |  |  |  |  |  |  |  |  |  |  |  |  |  |  |  |  |  |  |  |  |  |  |  |  |  |  |
| Sep-19 | 3.2 |  |  |  |  |  |  |  |  |  |  |  |  |  |  |  |  |  |  |  |  |  |  |  |  |  |  |  |  |  |  |  |  |  |  |  |  |  |  |  |  |  |  |  |  |  |  |  |  |  |  |
| Oct-19 | 4 |  |  |  |  |  |  |  |  |  |  |  |  |  |  |  |  |  |  |  |  |  |  |  |  |  |  |  |  |  |  |  |  |  |  |  |  |  |  |  |  |  |  |  |  |  |  |  |  |  |  |
| Nov-19 | 4.4 |  |  |  |  |  |  |  |  |  |  |  |  |  |  |  |  |  |  |  |  |  |  |  |  |  |  |  |  |  |  |  |  |  |  |  |  |  |  |  |  |  |  |  |  |  |  |  |  |  |  |
| Dec-19 | 5 |  |  |  |  |  |  |  |  |  |  |  |  |  |  |  |  |  |  |  |  |  |  |  |  |  |  |  |  |  |  |  |  |  |  |  |  |  |  |  |  |  |  |  |  |  |  |  |  |  |  |
| Jan-20 | 5.4 |  |  |  |  |  |  |  |  |  |  |  |  |  |  |  |  |  |  |  |  |  |  |  |  |  |  |  |  |  |  |  |  |  |  |  |  |  |  |  |  |  |  |  |  |  |  |  |  |  |  |
| Feb-20 | 5.5 |  |  |  |  |  |  |  |  |  |  |  |  |  |  |  |  |  |  |  |  |  |  |  |  |  |  |  |  |  |  |  |  |  |  |  |  |  |  |  |  |  |  |  |  |  |  |  |  |  |  |
| Mar-20 | 6.9 |  |  |  |  |  |  |  |  |  |  |  |  |  |  |  |  |  |  |  |  |  |  |  |  |  |  |  |  |  |  |  |  |  |  |  |  |  |  |  |  |  |  |  |  |  |  |  |  |  |  |
| Apr-20 | 16.6 |  |  |  |  |  |  |  |  |  |  |  |  |  |  |  |  |  |  |  |  |  |  |  |  |  |  |  |  |  |  |  |  |  |  |  |  |  |  |  |  |  |  |  |  |  |  |  |  |  |  |
| May-20 | 12.7 |  |  |  |  |  |  |  |  |  |  |  |  |  |  |  |  |  |  |  |  |  |  |  |  |  |  |  |  |  |  |  |  |  |  |  |  |  |  |  |  |  |  |  |  |  |  |  |  |  |  |
| Jun-20 | 10.1 |  |  |  |  |  |  |  |  |  |  |  |  |  |  |  |  |  |  |  |  |  |  |  |  |  |  |  |  |  |  |  |  |  |  |  |  |  |  |  |  |  |  |  |  |  |  |  |  |  |  |
| Jul-20 | 8.9 |  |  |  |  |  |  |  |  |  |  |  |  |  |  |  |  |  |  |  |  |  |  |  |  |  |  |  |  |  |  |  |  |  |  |  |  |  |  |  |  |  |  |  |  |  |  |  |  |  |  |
| Aug-20 | 7.6 |  |  |  |  |  |  |  |  |  |  |  |  |  |  |  |  |  |  |  |  |  |  |  |  |  |  |  |  |  |  |  |  |  |  |  |  |  |  |  |  |  |  |  |  |  |  |  |  |  |  |
| Sep-20 | 7.1 |  |  |  |  |  |  |  |  |  |  |  |  |  |  |  |  |  |  |  |  |  |  |  |  |  |  |  |  |  |  |  |  |  |  |  |  |  |  |  |  |  |  |  |  |  |  |  |  |  |  |
| Oct-20 | 6.8 |  |  |  |  |  |  |  |  |  |  |  |  |  |  |  |  |  |  |  |  |  |  |  |  |  |  |  |  |  |  |  |  |  |  |  |  |  |  |  |  |  |  |  |  |  |  |  |  |  |  |
| Nov-20 | 7.3 |  |  |  |  |  |  |  |  |  |  |  |  |  |  |  |  |  |  |  |  |  |  |  |  |  |  |  |  |  |  |  |  |  |  |  |  |  |  |  |  |  |  |  |  |  |  |  |  |  |  |
| Dec-20 | 9.6 |  |  |  |  |  |  |  |  |  |  |  |  |  |  |  |  |  |  |  |  |  |  |  |  |  |  |  |  |  |  |  |  |  |  |  |  |  |  |  |  |  |  |  |  |  |  |  |  |  |  |